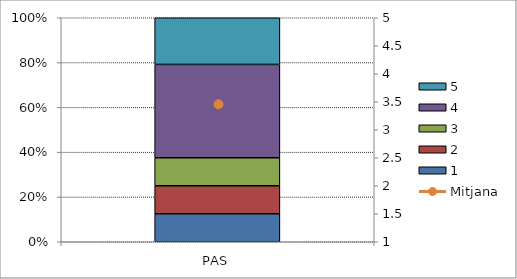
| Category | 1 | 2 | 3 | 4 | 5 |
|---|---|---|---|---|---|
| PAS | 3 | 3 | 3 | 10 | 5 |